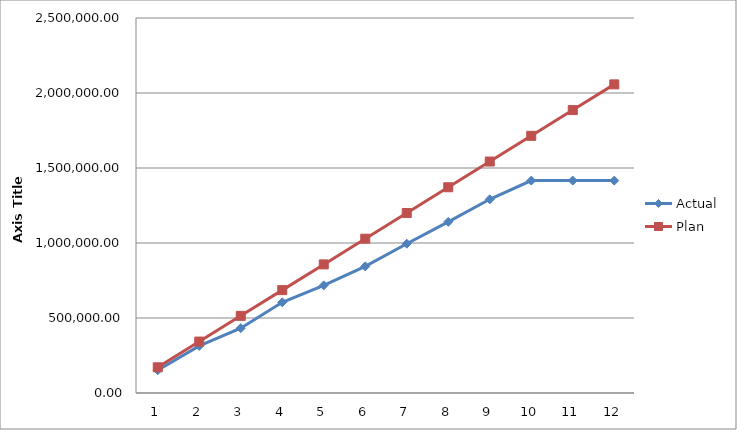
| Category | Actual | Plan |
|---|---|---|
| 0 | 151843.09 | 171454.667 |
| 1 | 313708.89 | 342909.333 |
| 2 | 431997.55 | 514364 |
| 3 | 604749.25 | 685818.667 |
| 4 | 717699.96 | 857273.333 |
| 5 | 843866.07 | 1028728 |
| 6 | 995339.96 | 1200182.667 |
| 7 | 1140665.96 | 1371637.333 |
| 8 | 1291377.31 | 1543092 |
| 9 | 1415921.43 | 1714546.667 |
| 10 | 1415921.43 | 1886001.333 |
| 11 | 1415921.43 | 2057456 |